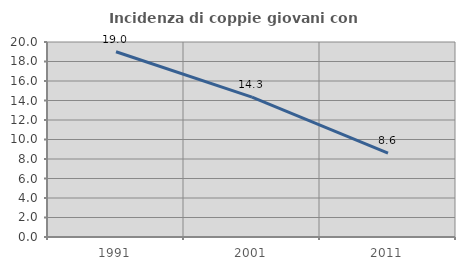
| Category | Incidenza di coppie giovani con figli |
|---|---|
| 1991.0 | 18.999 |
| 2001.0 | 14.342 |
| 2011.0 | 8.613 |